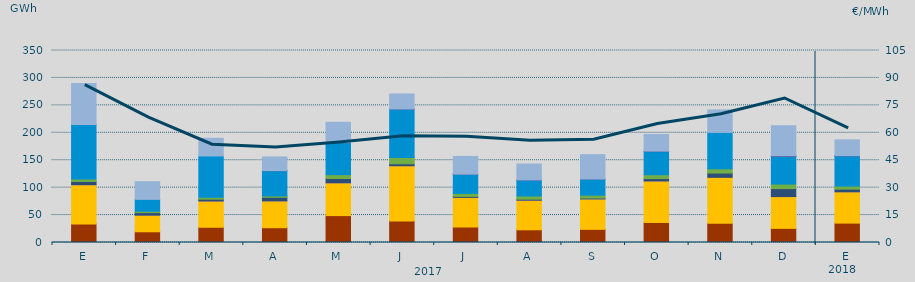
| Category | Carbón | Ciclo Combinado | Cogeneración | Consumo Bombeo | Eólica | Fuel-Gas | Hidráulica | Nuclear | Turbinación bombeo |
|---|---|---|---|---|---|---|---|---|---|
| E | 33693.8 | 71645.3 | 16.3 | 5899.1 | 4288.7 | 0 | 99664.7 | 0 | 74414.2 |
| F | 19518.4 | 30319.3 | 9.6 | 4595.7 | 2486.3 | 0 | 21689.9 | 0 | 32220.5 |
| M | 27782.8 | 47861.9 | 30.1 | 3279.6 | 3494.1 | 0 | 75296.7 | 0 | 32248 |
| A | 26944.8 | 48899.3 | 13.6 | 6553.1 | 2541.5 | 0 | 45882.6 | 122 | 24942.1 |
| M | 49018.7 | 59814.3 | 7.3 | 7845.9 | 7018.8 | 0 | 58284.6 | 169.5 | 36979 |
| J | 39223.4 | 100710.5 | 17.3 | 3498.8 | 11518.7 | 0 | 88256.3 | 69.8 | 27501.3 |
| J | 28227.7 | 53992.1 | 2.7 | 1736.9 | 5554.8 | 0 | 34688.7 | 310 | 32397.1 |
| A | 23185.3 | 53888.3 | 1.1 | 1823.4 | 5883.3 | 0 | 29023.6 | 148 | 29140 |
| S | 23990.4 | 55429.2 | 0.8 | 1551.4 | 5247.3 | 0 | 29358.5 | 3.1 | 44532.5 |
| O | 36235.6 | 75955.4 | 2 | 4285.9 | 7050.1 | 0 | 42190.9 | 700 | 30549.8 |
| N | 35124.9 | 83653.4 | 0 | 7774.4 | 7943.5 | 0 | 66112.3 | 0 | 41077.1 |
| D | 25784.6 | 57877.3 | 0 | 14602.9 | 8236.4 | 0 | 50297.7 | 1085.4 | 54906.6 |
| E | 35353.2 | 57056.1 | 10.8 | 4781.6 | 5669.6 | 0 | 55012.6 | 282.3 | 28937.8 |